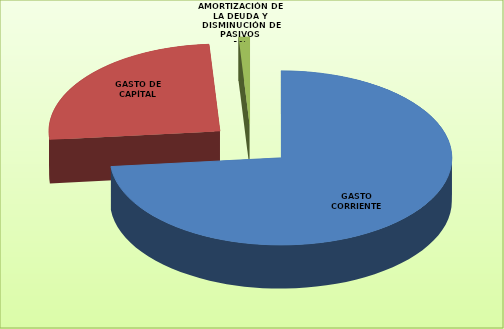
| Category | Series 0 |
|---|---|
| GASTO CORRIENTE | 21726337 |
| GASTO DE CAPÍTAL | 7570622 |
| AMORTIZACIÓN DE LA DEUDA Y DISMINUCIÓN DE PASIVOS | 302147 |